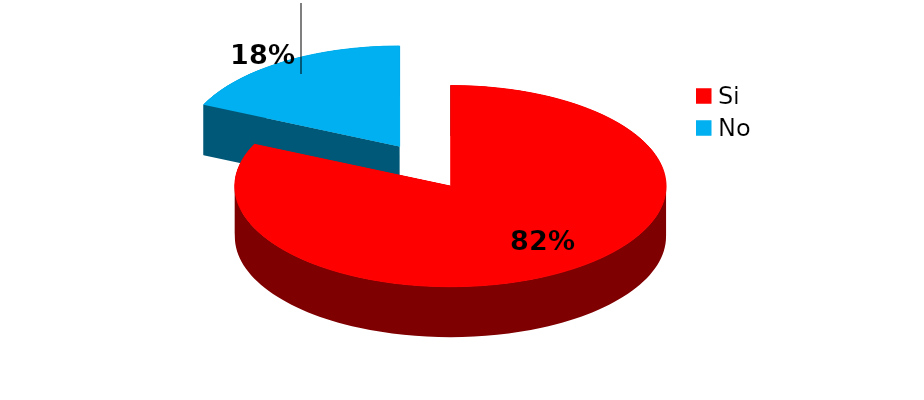
| Category | Series 0 |
|---|---|
| Si | 9 |
| No | 2 |